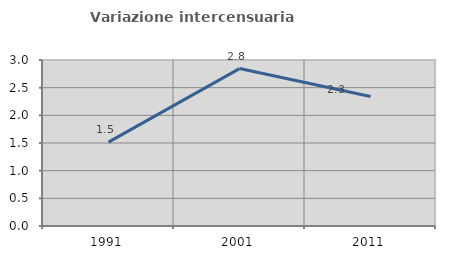
| Category | Variazione intercensuaria annua |
|---|---|
| 1991.0 | 1.515 |
| 2001.0 | 2.845 |
| 2011.0 | 2.34 |